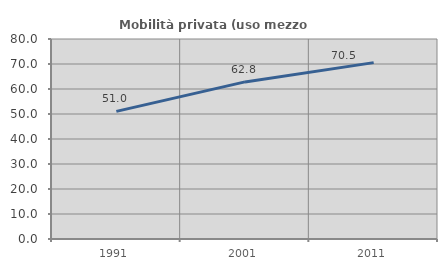
| Category | Mobilità privata (uso mezzo privato) |
|---|---|
| 1991.0 | 51.037 |
| 2001.0 | 62.837 |
| 2011.0 | 70.544 |